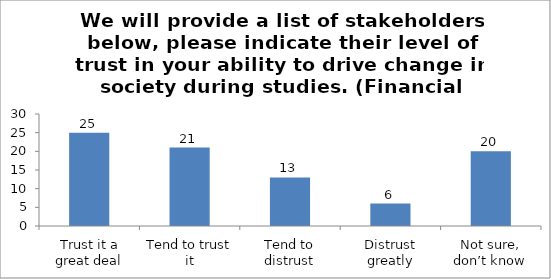
| Category | We will provide a list of stakeholders below, please indicate their level of trust in your ability to drive change in society during studies. (Financial Institutions ) |
|---|---|
| Trust it a great deal | 25 |
| Tend to trust it | 21 |
| Tend to distrust | 13 |
| Distrust greatly | 6 |
| Not sure, don’t know | 20 |